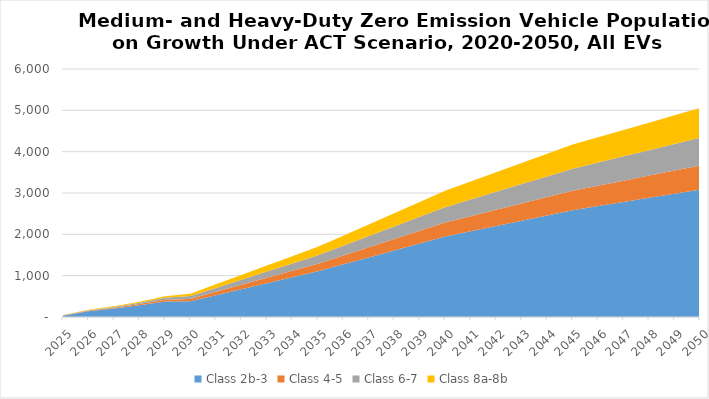
| Category | Class 2b-3 | Class 4-5 | Class 6-7 | Class 8a-8b |
|---|---|---|---|---|
| 2025.0 | 32.928 | 5.316 | 5.642 | 5.081 |
| 2026.0 | 140.458 | 11.433 | 12.284 | 10.837 |
| 2027.0 | 205.544 | 18.819 | 20.466 | 17.646 |
| 2028.0 | 283.891 | 28.83 | 31.728 | 26.147 |
| 2029.0 | 377.927 | 42.069 | 46.843 | 36.812 |
| 2030.0 | 378.082 | 60.025 | 67.61 | 59.099 |
| 2031.0 | 523.452 | 84.682 | 95.096 | 88.075 |
| 2032.0 | 668.822 | 109.339 | 122.583 | 117.05 |
| 2033.0 | 814.192 | 133.996 | 150.069 | 146.026 |
| 2034.0 | 959.562 | 158.652 | 177.556 | 175.002 |
| 2035.0 | 1104.932 | 183.309 | 205.042 | 203.977 |
| 2036.0 | 1273.559 | 214.133 | 237.906 | 243.107 |
| 2037.0 | 1442.186 | 244.957 | 270.77 | 282.237 |
| 2038.0 | 1610.813 | 275.781 | 303.634 | 321.367 |
| 2039.0 | 1779.441 | 306.605 | 336.498 | 360.497 |
| 2040.0 | 1948.068 | 337.429 | 369.362 | 399.627 |
| 2041.0 | 2075.591 | 363.903 | 402.143 | 436.456 |
| 2042.0 | 2203.114 | 390.377 | 434.924 | 473.284 |
| 2043.0 | 2330.638 | 416.85 | 467.706 | 510.112 |
| 2044.0 | 2458.161 | 443.324 | 500.487 | 546.94 |
| 2045.0 | 2585.685 | 469.797 | 533.269 | 583.769 |
| 2046.0 | 2685.25 | 492.001 | 560.804 | 611.079 |
| 2047.0 | 2784.816 | 514.205 | 588.34 | 638.388 |
| 2048.0 | 2884.382 | 536.409 | 615.875 | 665.698 |
| 2049.0 | 2983.947 | 558.613 | 643.41 | 693.008 |
| 2050.0 | 3083.513 | 580.816 | 670.945 | 720.318 |